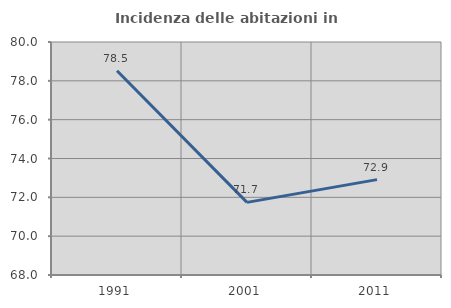
| Category | Incidenza delle abitazioni in proprietà  |
|---|---|
| 1991.0 | 78.522 |
| 2001.0 | 71.741 |
| 2011.0 | 72.912 |